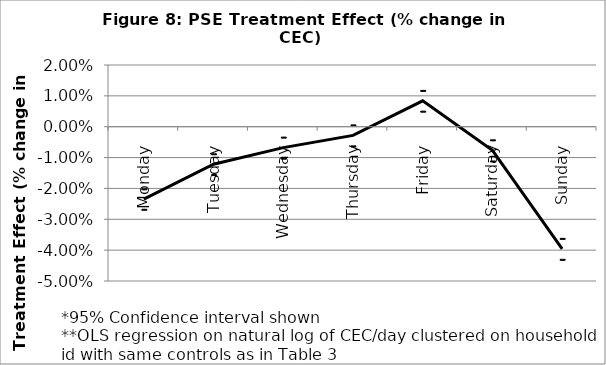
| Category | Series 0 | 2 Sd below | 2 SD above |
|---|---|---|---|
| Monday | -0.023 | -0.027 | -0.02 |
| Tuesday | -0.012 | -0.016 | -0.009 |
| Wednesday | -0.007 | -0.01 | -0.003 |
| Thursday | -0.003 | -0.006 | 0.001 |
| Friday | 0.008 | 0.005 | 0.012 |
| Saturday | -0.008 | -0.011 | -0.004 |
| Sunday | -0.04 | -0.043 | -0.036 |